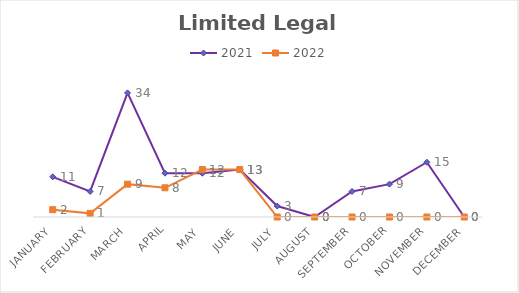
| Category | 2021 | 2022 |
|---|---|---|
| January | 11 | 2 |
| February | 7 | 1 |
| March | 34 | 9 |
| April | 12 | 8 |
| May | 12 | 13 |
| June | 13 | 13 |
| July | 3 | 0 |
| August | 0 | 0 |
| September | 7 | 0 |
| October | 9 | 0 |
| November | 15 | 0 |
| December | 0 | 0 |